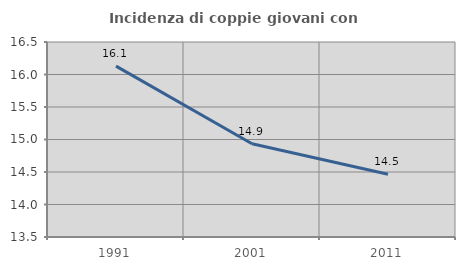
| Category | Incidenza di coppie giovani con figli |
|---|---|
| 1991.0 | 16.129 |
| 2001.0 | 14.935 |
| 2011.0 | 14.465 |